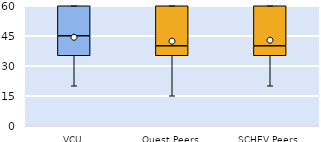
| Category | 25th | 50th | 75th |
|---|---|---|---|
| VCU | 35 | 10 | 15 |
| Quest Peers | 35 | 5 | 20 |
| SCHEV Peers | 35 | 5 | 20 |